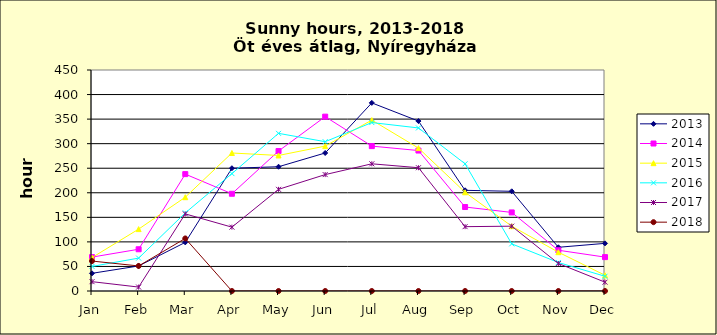
| Category | 2013 | 2014 | 2015 | 2016 | 2017 | 2018 |
|---|---|---|---|---|---|---|
| Jan | 36 | 69 | 68 | 50 | 19 | 61 |
| Feb | 51 | 85 | 126 | 67 | 8 | 51 |
| Mar | 99 | 238 | 191 | 159 | 157 | 107 |
| Apr | 250 | 198 | 281 | 239 | 130 | 0 |
| May | 253 | 285 | 276 | 321 | 207 | 0 |
| Jun | 281 | 355 | 295 | 304 | 237 | 0 |
| Jul | 383 | 295 | 348 | 343 | 259 | 0 |
| Aug | 346 | 286 | 291 | 332 | 251 | 0 |
| Sep | 205 | 171 | 201 | 259 | 131 | 0 |
| Oct | 203 | 160 | 132 | 96 | 132 | 0 |
| Nov | 89 | 83 | 79 | 58 | 56 | 0 |
| Dec | 97 | 69 | 32 | 30 | 18 | 0 |